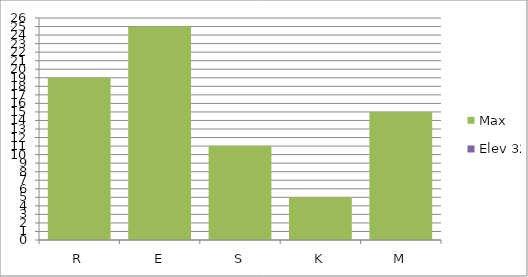
| Category | Max | Elev 32 |
|---|---|---|
| R | 19 | 0 |
| E | 25 | 0 |
| S | 11 | 0 |
| K | 5 | 0 |
| M | 15 | 0 |